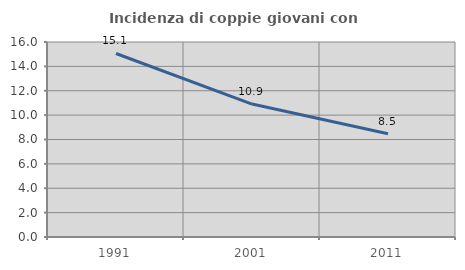
| Category | Incidenza di coppie giovani con figli |
|---|---|
| 1991.0 | 15.056 |
| 2001.0 | 10.907 |
| 2011.0 | 8.467 |